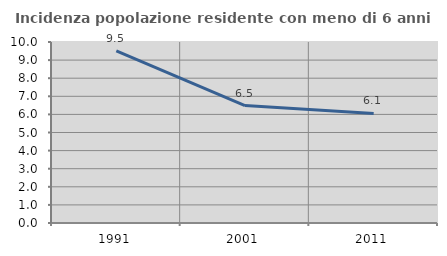
| Category | Incidenza popolazione residente con meno di 6 anni |
|---|---|
| 1991.0 | 9.512 |
| 2001.0 | 6.485 |
| 2011.0 | 6.05 |